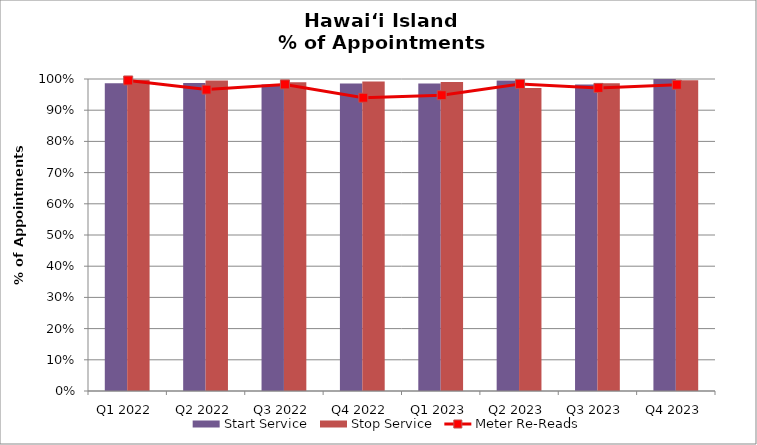
| Category | Start Service | Stop Service |
|---|---|---|
| Q1 2022 | 0.986 | 0.998 |
| Q2 2022 | 0.987 | 0.995 |
| Q3 2022 | 0.982 | 0.989 |
| Q4 2022 | 0.985 | 0.992 |
| Q1 2023 | 0.985 | 0.99 |
| Q2 2023 | 0.995 | 0.971 |
| Q3 2023 | 0.982 | 0.987 |
| Q4 2023 | 1 | 0.996 |